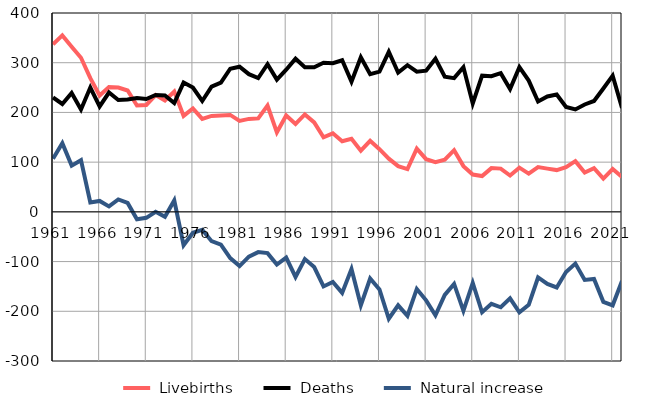
| Category |  Livebirths |  Deaths |  Natural increase |
|---|---|---|---|
| 1961.0 | 337 | 230 | 107 |
| 1962.0 | 355 | 217 | 138 |
| 1963.0 | 332 | 239 | 93 |
| 1964.0 | 310 | 206 | 104 |
| 1965.0 | 269 | 250 | 19 |
| 1966.0 | 234 | 212 | 22 |
| 1967.0 | 251 | 240 | 11 |
| 1968.0 | 250 | 225 | 25 |
| 1969.0 | 244 | 226 | 18 |
| 1970.0 | 214 | 229 | -15 |
| 1971.0 | 215 | 227 | -12 |
| 1972.0 | 235 | 235 | 0 |
| 1973.0 | 224 | 234 | -10 |
| 1974.0 | 242 | 219 | 23 |
| 1975.0 | 193 | 260 | -67 |
| 1976.0 | 208 | 250 | -42 |
| 1977.0 | 187 | 223 | -36 |
| 1978.0 | 193 | 252 | -59 |
| 1979.0 | 194 | 260 | -66 |
| 1980.0 | 195 | 288 | -93 |
| 1981.0 | 183 | 292 | -109 |
| 1982.0 | 187 | 277 | -90 |
| 1983.0 | 188 | 269 | -81 |
| 1984.0 | 214 | 297 | -83 |
| 1985.0 | 160 | 266 | -106 |
| 1986.0 | 194 | 286 | -92 |
| 1987.0 | 177 | 308 | -131 |
| 1988.0 | 196 | 291 | -95 |
| 1989.0 | 180 | 291 | -111 |
| 1990.0 | 150 | 300 | -150 |
| 1991.0 | 158 | 299 | -141 |
| 1992.0 | 142 | 305 | -163 |
| 1993.0 | 147 | 262 | -115 |
| 1994.0 | 123 | 311 | -188 |
| 1995.0 | 143 | 277 | -134 |
| 1996.0 | 126 | 282 | -156 |
| 1997.0 | 107 | 322 | -215 |
| 1998.0 | 92 | 280 | -188 |
| 1999.0 | 86 | 295 | -209 |
| 2000.0 | 127 | 282 | -155 |
| 2001.0 | 106 | 284 | -178 |
| 2002.0 | 100 | 308 | -208 |
| 2003.0 | 105 | 272 | -167 |
| 2004.0 | 124 | 269 | -145 |
| 2005.0 | 92 | 291 | -199 |
| 2006.0 | 75 | 218 | -143 |
| 2007.0 | 72 | 274 | -202 |
| 2008.0 | 88 | 273 | -185 |
| 2009.0 | 87 | 279 | -192 |
| 2010.0 | 73 | 247 | -174 |
| 2011.0 | 89 | 291 | -202 |
| 2012.0 | 77 | 264 | -187 |
| 2013.0 | 90 | 222 | -132 |
| 2014.0 | 87 | 232 | -145 |
| 2015.0 | 84 | 236 | -152 |
| 2016.0 | 90 | 211 | -121 |
| 2017.0 | 102 | 206 | -104 |
| 2018.0 | 79 | 216 | -137 |
| 2019.0 | 88 | 223 | -135 |
| 2020.0 | 67 | 248 | -181 |
| 2021.0 | 86 | 274 | -188 |
| 2022.0 | 70 | 209 | -139 |